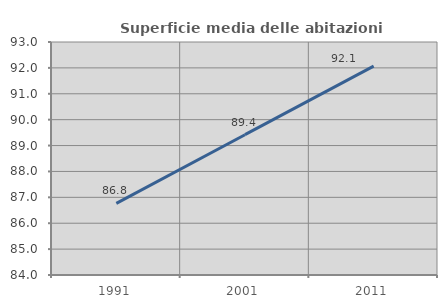
| Category | Superficie media delle abitazioni occupate |
|---|---|
| 1991.0 | 86.769 |
| 2001.0 | 89.419 |
| 2011.0 | 92.066 |